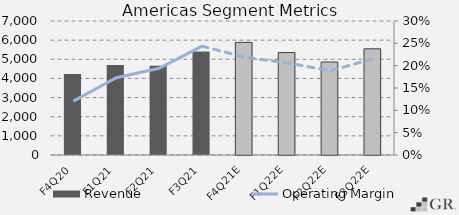
| Category | Revenue |
|---|---|
|  F4Q20  | 4232.9 |
|  F1Q21  | 4703.2 |
|  F2Q21  | 4664.6 |
|  F3Q21  | 5400.3 |
|  F4Q21E  | 5884.884 |
|  F1Q22E  | 5352.788 |
|  F2Q22E  | 4857.829 |
|  F3Q22E  | 5547.64 |